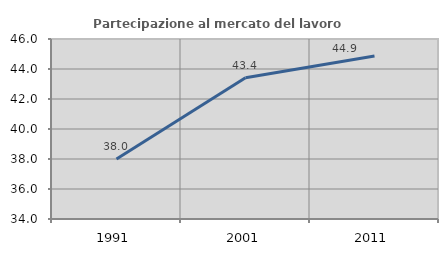
| Category | Partecipazione al mercato del lavoro  femminile |
|---|---|
| 1991.0 | 37.999 |
| 2001.0 | 43.42 |
| 2011.0 | 44.873 |